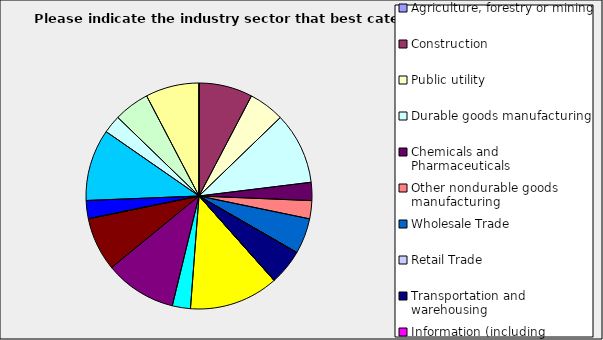
| Category | Series 0 |
|---|---|
| Agriculture, forestry or mining | 0 |
| Construction | 0.077 |
| Public utility | 0.051 |
| Durable goods manufacturing | 0.103 |
| Chemicals and Pharmaceuticals | 0.026 |
| Other nondurable goods manufacturing | 0.026 |
| Wholesale Trade | 0.051 |
| Retail Trade | 0 |
| Transportation and warehousing | 0.051 |
| Information (including broadcasting and telecommunication) | 0 |
| Finance and Insurance | 0.128 |
| Real Estate | 0.026 |
| Professional, scientific and technical services | 0.103 |
| Consulting | 0.077 |
| Administrative and office services (including waste management) | 0 |
| Education | 0.026 |
| Health Care and social services | 0.103 |
| Arts, entertainment and recreation | 0.026 |
| Accommodation and food services | 0.051 |
| Other | 0.077 |